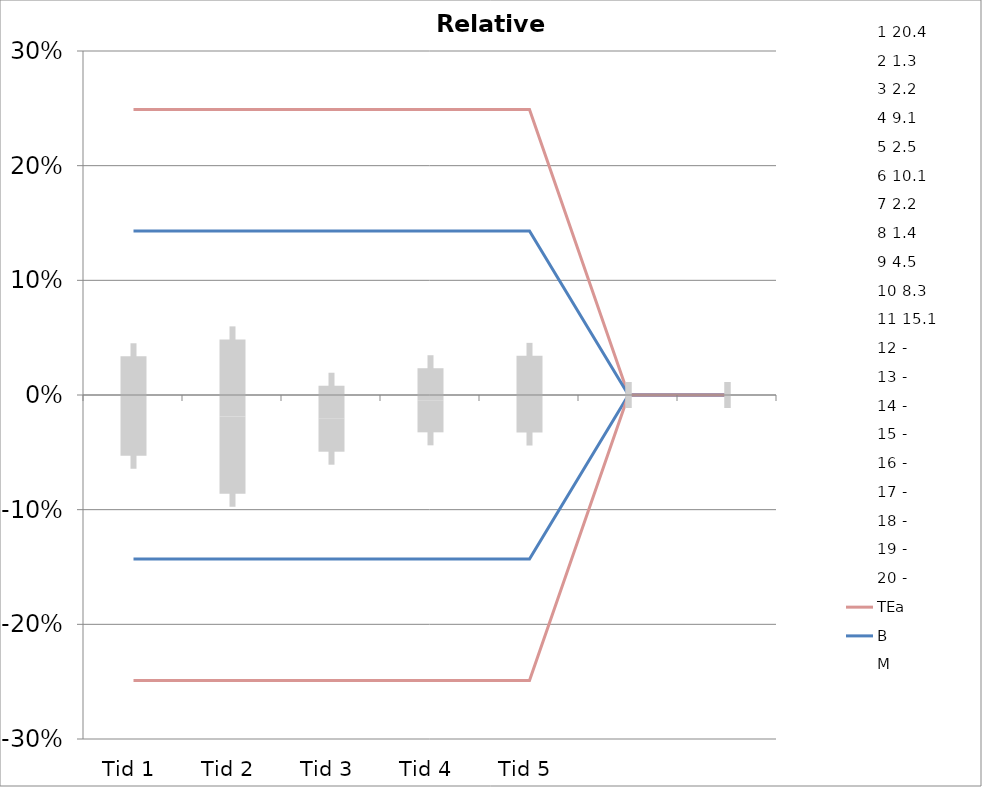
| Category | 1 | 2 | 3 | 4 | 5 | 6 | 7 | 8 | 9 | 10 | 11 | 12 | 13 | 14 | 15 | 16 | 17 | 18 | 19 | 20 | TEa | B | -B | -TEa | M |
|---|---|---|---|---|---|---|---|---|---|---|---|---|---|---|---|---|---|---|---|---|---|---|---|---|---|
| Tid 1 | -0.01 | 0.154 | -0.091 | -0.011 | -0.04 | 0 | -0.091 | 0 | -0.022 | 0.012 | -0.007 | 0 | 0 | 0 | 0 | 0 | 0 | 0 | 0 | 0 | 0.249 | 0.143 | -0.143 | -0.249 | -0.01 |
| Tid 2 | -0.044 | 0.154 | -0.091 | 0 | -0.16 | 0 | -0.091 | 0.071 | -0.089 | 0.048 | 0.013 | 0 | 0 | 0 | 0 | 0 | 0 | 0 | 0 | 0 | 0.249 | 0.143 | -0.143 | -0.249 | -0.019 |
| Tid 3 | -0.029 | 0 | -0.091 | 0 | -0.04 | 0 | 0 | -0.071 | 0.022 | 0.048 | -0.066 | 0 | 0 | 0 | 0 | 0 | 0 | 0 | 0 | 0 | 0.249 | 0.143 | -0.143 | -0.249 | -0.021 |
| Tid 4 | -0.044 | 0 | 0 | -0.011 | -0.04 | 0.02 | -0.091 | 0 | 0.022 | 0.06 | 0.033 | 0 | 0 | 0 | 0 | 0 | 0 | 0 | 0 | 0 | 0.249 | 0.143 | -0.143 | -0.249 | -0.005 |
| Tid 5 | 0.02 | 0 | -0.091 | -0.022 | 0 | 0.04 | 0.045 | 0.071 | 0 | 0.024 | -0.079 | 0 | 0 | 0 | 0 | 0 | 0 | 0 | 0 | 0 | 0.249 | 0.143 | -0.143 | -0.249 | 0.001 |